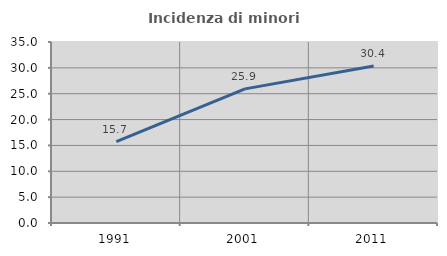
| Category | Incidenza di minori stranieri |
|---|---|
| 1991.0 | 15.714 |
| 2001.0 | 25.938 |
| 2011.0 | 30.367 |